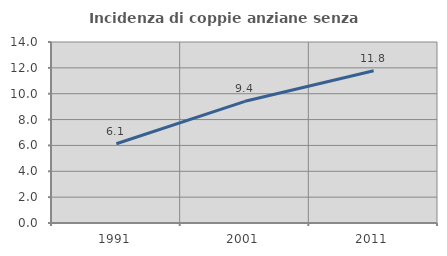
| Category | Incidenza di coppie anziane senza figli  |
|---|---|
| 1991.0 | 6.129 |
| 2001.0 | 9.411 |
| 2011.0 | 11.776 |